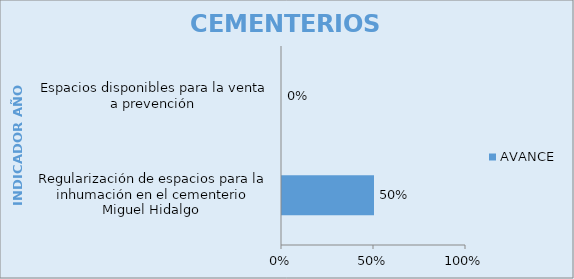
| Category | AVANCE |
|---|---|
| Regularización de espacios para la inhumación en el cementerio Miguel Hidalgo  | 0.5 |
| Espacios disponibles para la venta a prevención  | 0 |